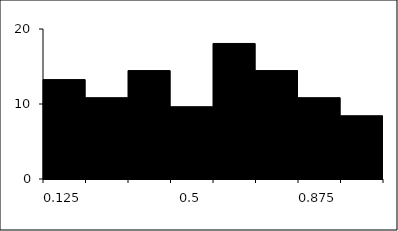
| Category | Series 1 |
|---|---|
| 0.125 | 13.253 |
| 0.25 | 10.843 |
| 0.375 | 14.458 |
| 0.5 | 9.639 |
| 0.625 | 18.072 |
| 0.75 | 14.458 |
| 0.875 | 10.843 |
| 1.0 | 8.434 |